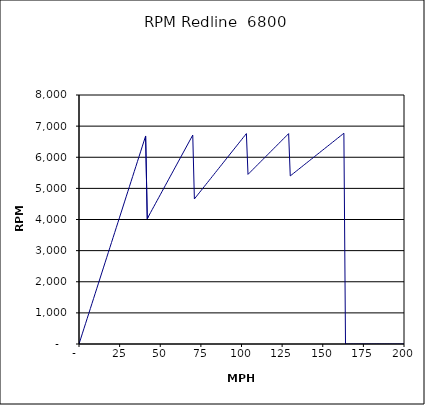
| Category | RPM Redline  6800 |
|---|---|
| 0.0 | 0 |
| 1.0 | 163.016 |
| 2.0 | 326.032 |
| 3.0 | 489.048 |
| 4.0 | 652.064 |
| 5.0 | 815.08 |
| 6.0 | 978.096 |
| 7.0 | 1141.112 |
| 8.0 | 1304.129 |
| 9.0 | 1467.145 |
| 10.0 | 1630.161 |
| 11.0 | 1793.177 |
| 12.0 | 1956.193 |
| 13.0 | 2119.209 |
| 14.0 | 2282.225 |
| 15.0 | 2445.241 |
| 16.0 | 2608.257 |
| 17.0 | 2771.273 |
| 18.0 | 2934.289 |
| 19.0 | 3097.305 |
| 20.0 | 3260.321 |
| 21.0 | 3423.337 |
| 22.0 | 3586.353 |
| 23.0 | 3749.37 |
| 24.0 | 3912.386 |
| 25.0 | 4075.402 |
| 26.0 | 4238.418 |
| 27.0 | 4401.434 |
| 28.0 | 4564.45 |
| 29.0 | 4727.466 |
| 30.0 | 4890.482 |
| 31.0 | 5053.498 |
| 32.0 | 5216.514 |
| 33.0 | 5379.53 |
| 34.0 | 5542.546 |
| 35.0 | 5705.562 |
| 36.0 | 5868.578 |
| 37.0 | 6031.595 |
| 38.0 | 6194.611 |
| 39.0 | 6357.627 |
| 40.0 | 6520.643 |
| 41.0 | 6683.659 |
| 42.0 | 4027.456 |
| 43.0 | 4123.348 |
| 44.0 | 4219.239 |
| 45.0 | 4315.131 |
| 46.0 | 4411.023 |
| 47.0 | 4506.915 |
| 48.0 | 4602.807 |
| 49.0 | 4698.698 |
| 50.0 | 4794.59 |
| 51.0 | 4890.482 |
| 52.0 | 4986.374 |
| 53.0 | 5082.266 |
| 54.0 | 5178.157 |
| 55.0 | 5274.049 |
| 56.0 | 5369.941 |
| 57.0 | 5465.833 |
| 58.0 | 5561.725 |
| 59.0 | 5657.616 |
| 60.0 | 5753.508 |
| 61.0 | 5849.4 |
| 62.0 | 5945.292 |
| 63.0 | 6041.184 |
| 64.0 | 6137.075 |
| 65.0 | 6232.967 |
| 66.0 | 6328.859 |
| 67.0 | 6424.751 |
| 68.0 | 6520.643 |
| 69.0 | 6616.535 |
| 70.0 | 6712.426 |
| 71.0 | 4659.719 |
| 72.0 | 4725.349 |
| 73.0 | 4790.979 |
| 74.0 | 4856.609 |
| 75.0 | 4922.238 |
| 76.0 | 4987.868 |
| 77.0 | 5053.498 |
| 78.0 | 5119.128 |
| 79.0 | 5184.758 |
| 80.0 | 5250.388 |
| 81.0 | 5316.017 |
| 82.0 | 5381.647 |
| 83.0 | 5447.277 |
| 84.0 | 5512.907 |
| 85.0 | 5578.537 |
| 86.0 | 5644.167 |
| 87.0 | 5709.797 |
| 88.0 | 5775.426 |
| 89.0 | 5841.056 |
| 90.0 | 5906.686 |
| 91.0 | 5972.316 |
| 92.0 | 6037.946 |
| 93.0 | 6103.576 |
| 94.0 | 6169.205 |
| 95.0 | 6234.835 |
| 96.0 | 6300.465 |
| 97.0 | 6366.095 |
| 98.0 | 6431.725 |
| 99.0 | 6497.355 |
| 100.0 | 6562.985 |
| 101.0 | 6628.614 |
| 102.0 | 6694.244 |
| 103.0 | 6759.874 |
| 104.0 | 5449.394 |
| 105.0 | 5501.792 |
| 106.0 | 5554.19 |
| 107.0 | 5606.588 |
| 108.0 | 5658.986 |
| 109.0 | 5711.384 |
| 110.0 | 5763.782 |
| 111.0 | 5816.18 |
| 112.0 | 5868.578 |
| 113.0 | 5920.976 |
| 114.0 | 5973.374 |
| 115.0 | 6025.773 |
| 116.0 | 6078.171 |
| 117.0 | 6130.569 |
| 118.0 | 6182.967 |
| 119.0 | 6235.365 |
| 120.0 | 6287.763 |
| 121.0 | 6340.161 |
| 122.0 | 6392.559 |
| 123.0 | 6444.957 |
| 124.0 | 6497.355 |
| 125.0 | 6549.753 |
| 126.0 | 6602.151 |
| 127.0 | 6654.549 |
| 128.0 | 6706.947 |
| 129.0 | 6759.345 |
| 130.0 | 5400.301 |
| 131.0 | 5441.841 |
| 132.0 | 5483.382 |
| 133.0 | 5524.923 |
| 134.0 | 5566.464 |
| 135.0 | 5608.004 |
| 136.0 | 5649.545 |
| 137.0 | 5691.086 |
| 138.0 | 5732.627 |
| 139.0 | 5774.168 |
| 140.0 | 5815.708 |
| 141.0 | 5857.249 |
| 142.0 | 5898.79 |
| 143.0 | 5940.331 |
| 144.0 | 5981.871 |
| 145.0 | 6023.412 |
| 146.0 | 6064.953 |
| 147.0 | 6106.494 |
| 148.0 | 6148.035 |
| 149.0 | 6189.575 |
| 150.0 | 6231.116 |
| 151.0 | 6272.657 |
| 152.0 | 6314.198 |
| 153.0 | 6355.738 |
| 154.0 | 6397.279 |
| 155.0 | 6438.82 |
| 156.0 | 6480.361 |
| 157.0 | 6521.902 |
| 158.0 | 6563.442 |
| 159.0 | 6604.983 |
| 160.0 | 6646.524 |
| 161.0 | 6688.065 |
| 162.0 | 6729.605 |
| 163.0 | 6771.146 |
| 164.0 | 0 |
| 165.0 | 0 |
| 166.0 | 0 |
| 167.0 | 0 |
| 168.0 | 0 |
| 169.0 | 0 |
| 170.0 | 0 |
| 171.0 | 0 |
| 172.0 | 0 |
| 173.0 | 0 |
| 174.0 | 0 |
| 175.0 | 0 |
| 176.0 | 0 |
| 177.0 | 0 |
| 178.0 | 0 |
| 179.0 | 0 |
| 180.0 | 0 |
| 181.0 | 0 |
| 182.0 | 0 |
| 183.0 | 0 |
| 184.0 | 0 |
| 185.0 | 0 |
| 186.0 | 0 |
| 187.0 | 0 |
| 188.0 | 0 |
| 189.0 | 0 |
| 190.0 | 0 |
| 191.0 | 0 |
| 192.0 | 0 |
| 193.0 | 0 |
| 194.0 | 0 |
| 195.0 | 0 |
| 196.0 | 0 |
| 197.0 | 0 |
| 198.0 | 0 |
| 199.0 | 0 |
| 200.0 | 0 |